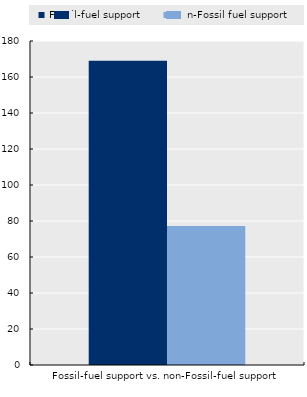
| Category | Fossil-fuel support | Non-Fossil fuel support |
|---|---|---|
| Fossil-fuel support vs. non-Fossil-fuel support | 169083686585.652 | 77176655967.732 |